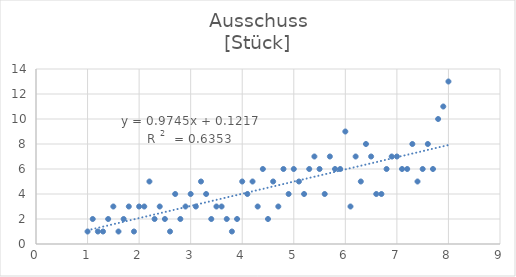
| Category | Ausschuss
[Stück] |
|---|---|
| 1.0 | 1 |
| 1.1 | 2 |
| 1.2 | 1 |
| 1.3 | 1 |
| 1.4 | 2 |
| 1.5 | 3 |
| 1.6 | 1 |
| 1.7 | 2 |
| 1.8 | 3 |
| 1.9 | 1 |
| 2.0 | 3 |
| 2.1 | 3 |
| 2.2 | 5 |
| 2.3 | 2 |
| 2.4 | 3 |
| 2.5 | 2 |
| 2.6 | 1 |
| 2.7 | 4 |
| 2.8 | 2 |
| 2.9 | 3 |
| 3.0 | 4 |
| 3.1 | 3 |
| 3.2 | 5 |
| 3.3 | 4 |
| 3.4 | 2 |
| 3.5 | 3 |
| 3.6 | 3 |
| 3.7 | 2 |
| 3.8 | 1 |
| 3.9 | 2 |
| 4.0 | 5 |
| 4.1 | 4 |
| 4.2 | 5 |
| 4.3 | 3 |
| 4.4 | 6 |
| 4.5 | 2 |
| 4.6 | 5 |
| 4.7 | 3 |
| 4.8 | 6 |
| 4.9 | 4 |
| 5.0 | 6 |
| 5.1 | 5 |
| 5.2 | 4 |
| 5.3 | 6 |
| 5.4 | 7 |
| 5.5 | 6 |
| 5.6 | 4 |
| 5.7 | 7 |
| 5.8 | 6 |
| 5.9 | 6 |
| 6.0 | 9 |
| 6.1 | 3 |
| 6.2 | 7 |
| 6.3 | 5 |
| 6.4 | 8 |
| 6.50000000000001 | 7 |
| 6.6 | 4 |
| 6.7 | 4 |
| 6.80000000000001 | 6 |
| 6.90000000000001 | 7 |
| 7.00000000000001 | 7 |
| 7.1 | 6 |
| 7.20000000000001 | 6 |
| 7.30000000000001 | 8 |
| 7.40000000000001 | 5 |
| 7.50000000000001 | 6 |
| 7.60000000000001 | 8 |
| 7.70000000000001 | 6 |
| 7.80000000000001 | 10 |
| 7.90000000000001 | 11 |
| 8.00000000000001 | 13 |